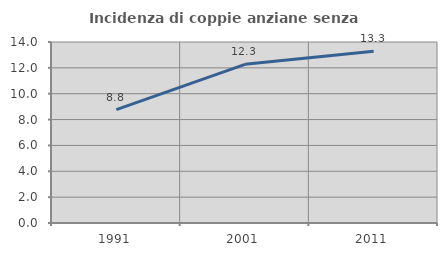
| Category | Incidenza di coppie anziane senza figli  |
|---|---|
| 1991.0 | 8.77 |
| 2001.0 | 12.271 |
| 2011.0 | 13.279 |